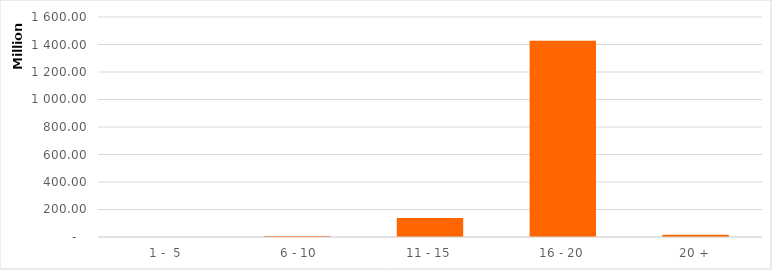
| Category | Series 0 |
|---|---|
|  1 -  5 | 0 |
|  6 - 10 | 7013447.3 |
| 11 - 15 | 137378794.9 |
| 16 - 20 | 1426993940.71 |
| 20 + | 16247127.03 |